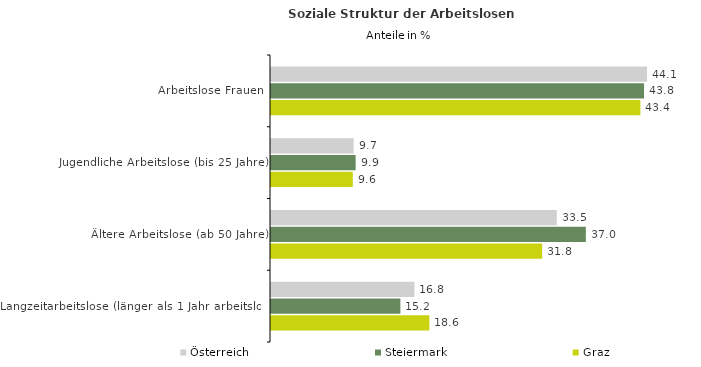
| Category | Österreich | Steiermark | Graz |
|---|---|---|---|
| Arbeitslose Frauen | 44.136 | 43.785 | 43.358 |
| Jugendliche Arbeitslose (bis 25 Jahre) | 9.698 | 9.935 | 9.601 |
| Ältere Arbeitslose (ab 50 Jahre) | 33.548 | 36.954 | 31.827 |
| Langzeitarbeitslose (länger als 1 Jahr arbeitslos) | 16.836 | 15.186 | 18.585 |